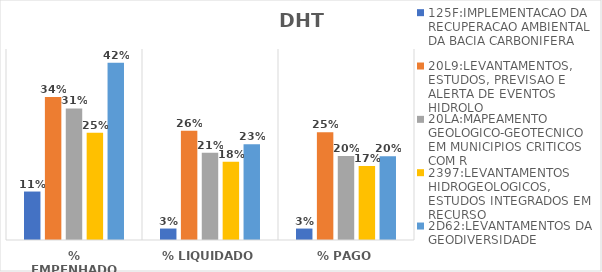
| Category | 125F:IMPLEMENTACAO DA RECUPERACAO AMBIENTAL DA BACIA CARBONIFERA | 20L9:LEVANTAMENTOS, ESTUDOS, PREVISAO E ALERTA DE EVENTOS HIDROLO | 20LA:MAPEAMENTO GEOLOGICO-GEOTECNICO EM MUNICIPIOS CRITICOS COM R | 2397:LEVANTAMENTOS HIDROGEOLOGICOS, ESTUDOS INTEGRADOS EM RECURSO | 2D62:LEVANTAMENTOS DA GEODIVERSIDADE |
|---|---|---|---|---|---|
| % EMPENHADO | 0.114 | 0.337 | 0.31 | 0.253 | 0.417 |
| % LIQUIDADO | 0.027 | 0.258 | 0.205 | 0.184 | 0.226 |
| % PAGO | 0.027 | 0.254 | 0.198 | 0.174 | 0.197 |